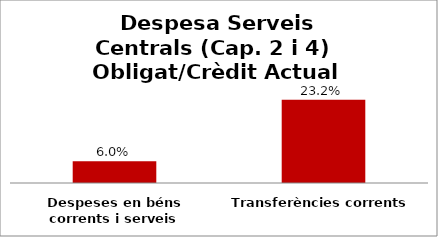
| Category | Series 0 |
|---|---|
| Despeses en béns corrents i serveis | 0.06 |
| Transferències corrents | 0.232 |